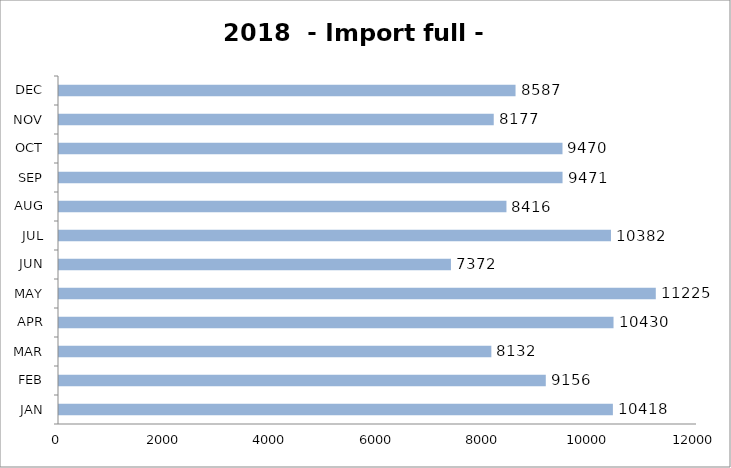
| Category | Import full - 20' |
|---|---|
| JAN | 10418 |
| FEB | 9156 |
| MAR | 8132 |
| APR | 10430 |
| MAY | 11225 |
| JUN | 7372 |
| JUL | 10382 |
| AUG | 8416 |
| SEP | 9471 |
| OCT | 9470 |
| NOV | 8177 |
| DEC | 8587 |